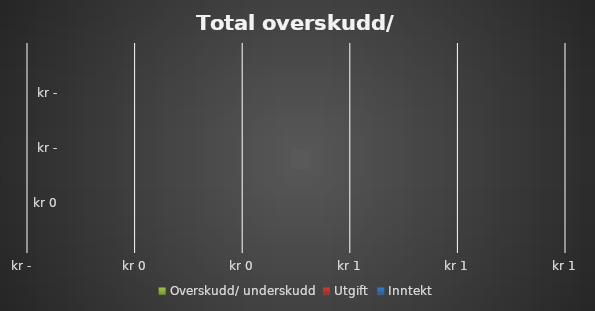
| Category | Overskudd/ underskudd | Utgift | Inntekt |
|---|---|---|---|
| 0.0 | 0 | 0 | 0 |